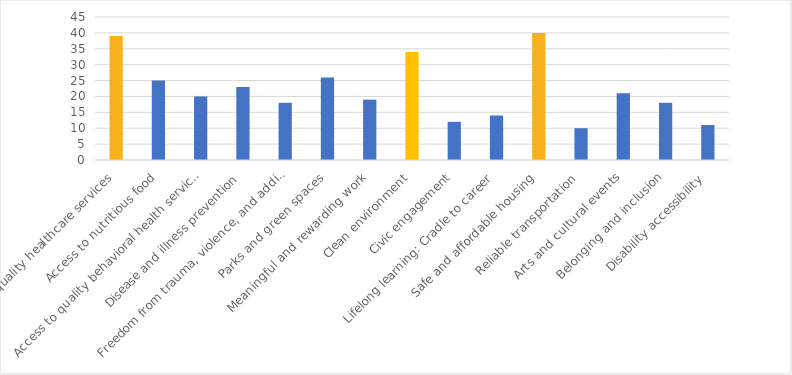
| Category | Number of Responses |
|---|---|
| Access to quality healthcare services | 39 |
| Access to nutritious food | 25 |
| Access to quality behavioral health services | 20 |
| Disease and illness prevention | 23 |
| Freedom from trauma, violence, and addiction | 18 |
| Parks and green spaces | 26 |
| Meaningful and rewarding work | 19 |
| Clean environment | 34 |
| Civic engagement | 12 |
| Lifelong learning: Cradle to career | 14 |
| Safe and affordable housing | 40 |
| Reliable transportation | 10 |
| Arts and cultural events | 21 |
| Belonging and inclusion | 18 |
| Disability accessibility | 11 |